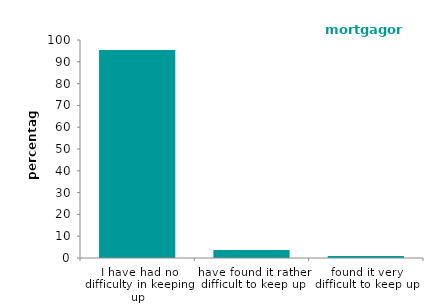
| Category | mortgagors  |
|---|---|
| I have had no difficulty in keeping up | 95.451 |
| have found it rather difficult to keep up | 3.683 |
| found it very difficult to keep up | 0.866 |